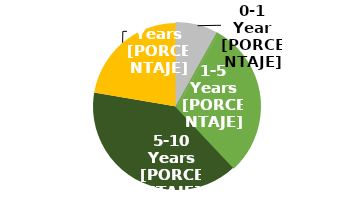
| Category | Series 0 |
|---|---|
| 0-1 Año | 0.081 |
| 1-5 Años | 0.298 |
| 5-10 Años | 0.397 |
| +10 Años | 0.223 |